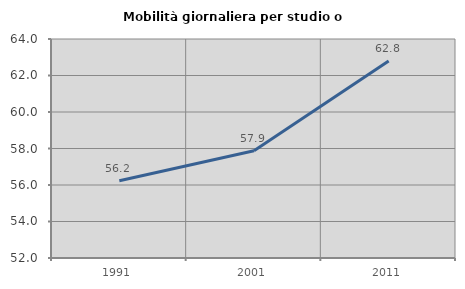
| Category | Mobilità giornaliera per studio o lavoro |
|---|---|
| 1991.0 | 56.231 |
| 2001.0 | 57.878 |
| 2011.0 | 62.797 |